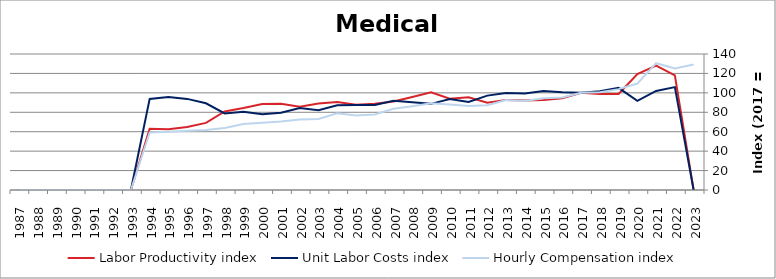
| Category | Labor Productivity index | Unit Labor Costs index | Hourly Compensation index |
|---|---|---|---|
| 2023.0 | 0 | 0 | 129.153 |
| 2022.0 | 117.967 | 105.956 | 124.992 |
| 2021.0 | 128.068 | 101.942 | 130.555 |
| 2020.0 | 119.278 | 91.861 | 109.57 |
| 2019.0 | 98.781 | 105.127 | 103.846 |
| 2018.0 | 98.813 | 101.761 | 100.553 |
| 2017.0 | 100 | 100 | 100 |
| 2016.0 | 94.534 | 100.678 | 95.175 |
| 2015.0 | 92.563 | 101.954 | 94.372 |
| 2014.0 | 92.192 | 99.431 | 91.667 |
| 2013.0 | 92.767 | 99.776 | 92.559 |
| 2012.0 | 89.917 | 97.143 | 87.349 |
| 2011.0 | 95.429 | 90.564 | 86.424 |
| 2010.0 | 94.05 | 93.705 | 88.13 |
| 2009.0 | 100.617 | 88.676 | 89.223 |
| 2008.0 | 95.642 | 90.206 | 86.275 |
| 2007.0 | 91.03 | 91.858 | 83.619 |
| 2006.0 | 88.839 | 87.588 | 77.812 |
| 2005.0 | 87.75 | 87.378 | 76.674 |
| 2004.0 | 90.656 | 87.211 | 79.061 |
| 2003.0 | 89.022 | 82.226 | 73.2 |
| 2002.0 | 85.78 | 84.497 | 72.481 |
| 2001.0 | 88.723 | 79.569 | 70.596 |
| 2000.0 | 88.58 | 78.07 | 69.155 |
| 1999.0 | 84.356 | 80.498 | 67.905 |
| 1998.0 | 80.889 | 78.788 | 63.731 |
| 1997.0 | 69.115 | 89.304 | 61.723 |
| 1996.0 | 64.911 | 93.783 | 60.876 |
| 1995.0 | 62.598 | 95.736 | 59.928 |
| 1994.0 | 63.068 | 93.763 | 59.134 |
| 1993.0 | 0 | 0 | 0 |
| 1992.0 | 0 | 0 | 0 |
| 1991.0 | 0 | 0 | 0 |
| 1990.0 | 0 | 0 | 0 |
| 1989.0 | 0 | 0 | 0 |
| 1988.0 | 0 | 0 | 0 |
| 1987.0 | 0 | 0 | 0 |